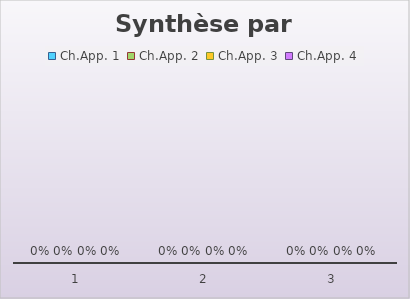
| Category | Ch.App. 1 | Ch.App. 2 | Ch.App. 3 | Ch.App. 4 |
|---|---|---|---|---|
| 1.0 | 0 | 0 | 0 | 0 |
| 2.0 | 0 | 0 | 0 | 0 |
| 3.0 | 0 | 0 | 0 | 0 |